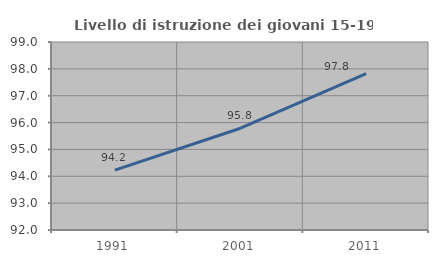
| Category | Livello di istruzione dei giovani 15-19 anni |
|---|---|
| 1991.0 | 94.231 |
| 2001.0 | 95.789 |
| 2011.0 | 97.826 |